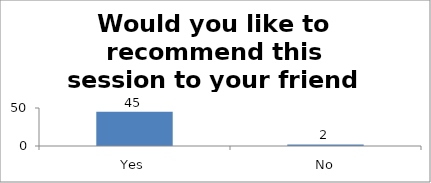
| Category | Would you like to recommend this session to your friend or colleague? |
|---|---|
| Yes | 45 |
| No | 2 |